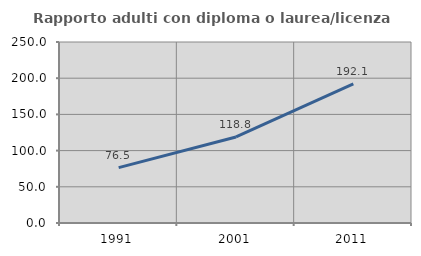
| Category | Rapporto adulti con diploma o laurea/licenza media  |
|---|---|
| 1991.0 | 76.518 |
| 2001.0 | 118.799 |
| 2011.0 | 192.086 |